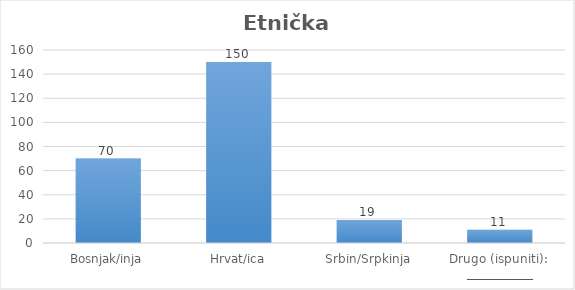
| Category | Etnička pripadnost |
|---|---|
| Bosnjak/inja | 70 |
| Hrvat/ica | 150 |
| Srbin/Srpkinja | 19 |
| Drugo (ispuniti):  ___________ | 11 |